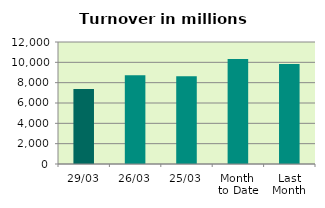
| Category | Series 0 |
|---|---|
| 29/03 | 7381.773 |
| 26/03 | 8725.585 |
| 25/03 | 8640.995 |
| Month 
to Date | 10319.682 |
| Last
Month | 9824.278 |